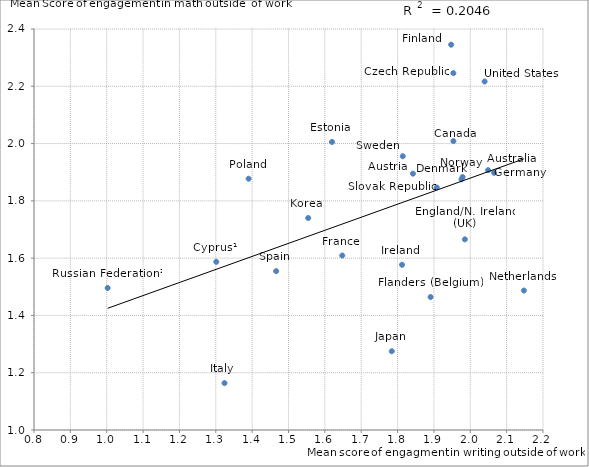
| Category | Series 1 |
|---|---|
| 2.048890682148925 | 1.907 |
| 1.8422964631843721 | 1.895 |
| 1.953556336087421 | 2.008 |
| 1.3013071717306486 | 1.587 |
| 1.9534342954873916 | 2.246 |
| 1.9759044359749076 | 1.875 |
| 1.985050663292204 | 1.666 |
| 1.6197662954343177 | 2.006 |
| 1.9473360084424924 | 2.345 |
| 1.890791285985241 | 1.464 |
| 1.647864696349912 | 1.609 |
| 2.065356596233733 | 1.898 |
| 1.8122881066966385 | 1.577 |
| 1.3239617300755377 | 1.164 |
| 1.7840529693360243 | 1.275 |
| 1.5541587213633408 | 1.74 |
| 2.147380224055448 | 1.487 |
| 1.9788695099470974 | 1.883 |
| 1.3902924304094395 | 1.877 |
| 1.0025636295136857 | 1.496 |
| 1.9078483691089367 | 1.847 |
| 1.4660597434067497 | 1.555 |
| 1.8143626963634663 | 1.956 |
| 2.0393934889686105 | 2.217 |